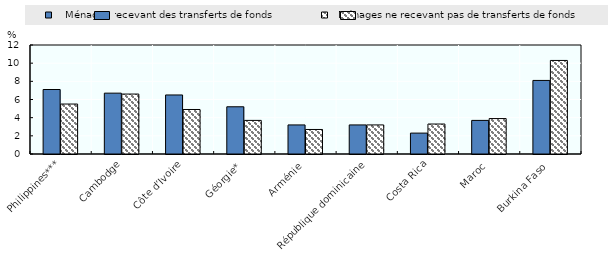
| Category |    Ménages recevant des transferts de fonds |   Ménages ne recevant pas de transferts de fonds |
|---|---|---|
| Philippines*** | 7.1 | 5.5 |
| Cambodge | 6.7 | 6.6 |
| Côte d’Ivoire | 6.5 | 4.9 |
| Géorgie* | 5.2 | 3.7 |
| Arménie | 3.2 | 2.7 |
| République dominicaine | 3.2 | 3.2 |
| Costa Rica | 2.3 | 3.3 |
| Maroc | 3.7 | 3.9 |
| Burkina Faso | 8.1 | 10.3 |